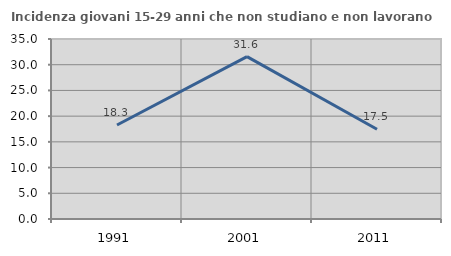
| Category | Incidenza giovani 15-29 anni che non studiano e non lavorano  |
|---|---|
| 1991.0 | 18.275 |
| 2001.0 | 31.579 |
| 2011.0 | 17.46 |